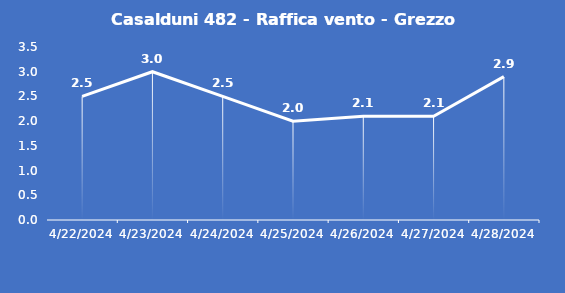
| Category | Casalduni 482 - Raffica vento - Grezzo (m/s) |
|---|---|
| 4/22/24 | 2.5 |
| 4/23/24 | 3 |
| 4/24/24 | 2.5 |
| 4/25/24 | 2 |
| 4/26/24 | 2.1 |
| 4/27/24 | 2.1 |
| 4/28/24 | 2.9 |